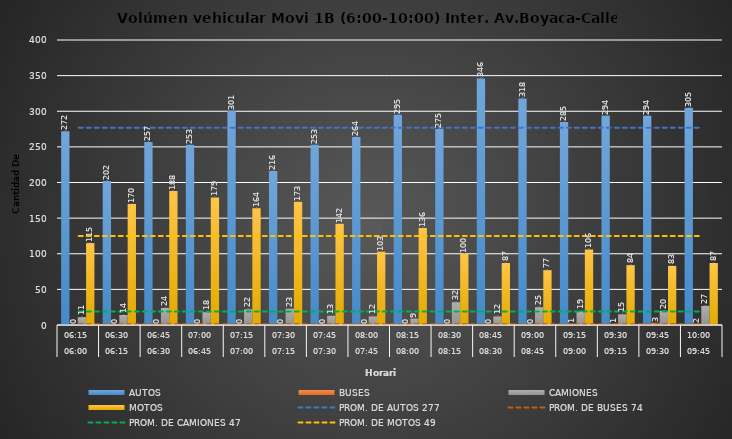
| Category | AUTOS | BUSES | CAMIONES | MOTOS |
|---|---|---|---|---|
| 0 | 272 | 0 | 11 | 115 |
| 1 | 202 | 0 | 14 | 170 |
| 2 | 257 | 0 | 24 | 188 |
| 3 | 253 | 0 | 18 | 179 |
| 4 | 301 | 0 | 22 | 164 |
| 5 | 216 | 0 | 23 | 173 |
| 6 | 253 | 0 | 13 | 142 |
| 7 | 264 | 0 | 12 | 103 |
| 8 | 295 | 0 | 9 | 136 |
| 9 | 275 | 0 | 32 | 100 |
| 10 | 346 | 0 | 12 | 87 |
| 11 | 318 | 0 | 25 | 77 |
| 12 | 285 | 1 | 19 | 106 |
| 13 | 294 | 1 | 15 | 84 |
| 14 | 294 | 3 | 20 | 83 |
| 15 | 305 | 2 | 27 | 87 |